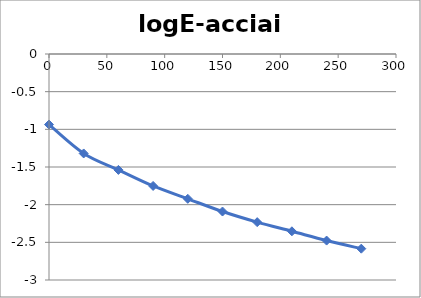
| Category | logE-acciaio |
|---|---|
| 0.0 | -0.937 |
| 30.0 | -1.32 |
| 60.0 | -1.539 |
| 90.0 | -1.751 |
| 120.0 | -1.922 |
| 150.0 | -2.091 |
| 180.0 | -2.232 |
| 210.0 | -2.354 |
| 240.0 | -2.477 |
| 270.0 | -2.584 |